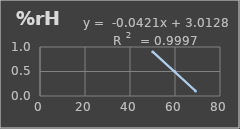
| Category | Humedad |
|---|---|
| 50.1 | 0.9 |
| 59.9 | 0.5 |
| 69.1 | 0.1 |